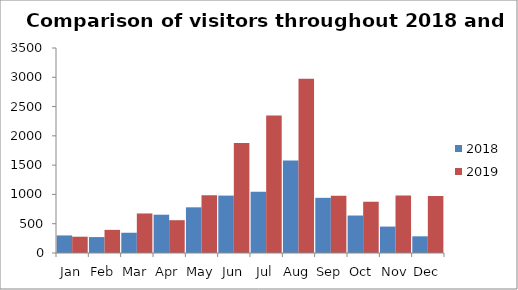
| Category | 2018 | 2019 |
|---|---|---|
| Jan | 300 | 278 |
| Feb | 272 | 395 |
| Mar | 346 | 675 |
| Apr | 654 | 560 |
| May | 780 | 984 |
| Jun | 980 | 1879 |
| Jul | 1046 | 2348 |
| Aug | 1578 | 2975 |
| Sep | 942 | 978 |
| Oct | 640 | 875 |
| Nov | 451 | 980 |
| Dec | 285 | 974 |